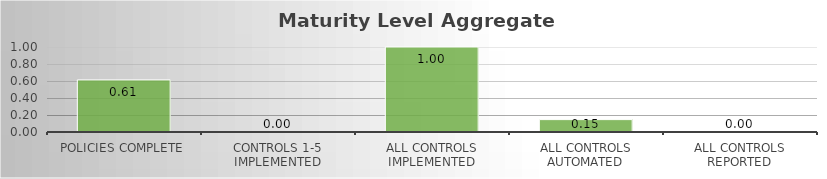
| Category | Score: |
|---|---|
| Policies Complete | 0.613 |
| Controls 1-5 Implemented | 0 |
| All Controls Implemented | 1 |
| All Controls Automated | 0.146 |
| All Controls Reported | 0 |